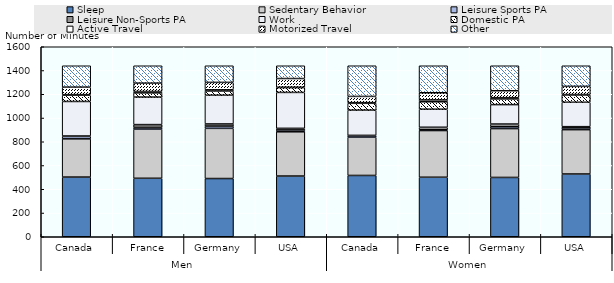
| Category | Sleep | Sedentary Behavior | Leisure Sports PA | Leisure Non-Sports PA | Work | Domestic PA | Active Travel | Motorized Travel | Other |
|---|---|---|---|---|---|---|---|---|---|
| 0 | 502.6 | 321.8 | 20.4 | 3.7 | 290.7 | 52.5 | 5.1 | 63.3 | 179.8 |
| 1 | 492.4 | 414.2 | 13.9 | 23.9 | 231.9 | 35.1 | 12 | 69.9 | 146.7 |
| 2 | 490.3 | 422.7 | 18.8 | 18.2 | 242 | 35.2 | 10 | 62.7 | 140 |
| 3 | 511.2 | 372.7 | 15.5 | 13.5 | 302.6 | 40.5 | 3.3 | 73.2 | 107.5 |
| 4 | 516.3 | 322.4 | 13.6 | 1.5 | 212.5 | 57.5 | 5.6 | 52.4 | 258.3 |
| 5 | 501.3 | 393.1 | 6.7 | 21 | 152.1 | 62.3 | 15.7 | 60.4 | 227.3 |
| 6 | 499.6 | 411.2 | 15.6 | 22.7 | 163.7 | 47.5 | 11 | 58.4 | 210.3 |
| 7 | 528.5 | 373.4 | 14.7 | 10.4 | 205.7 | 62.4 | 2.5 | 68.9 | 173.5 |